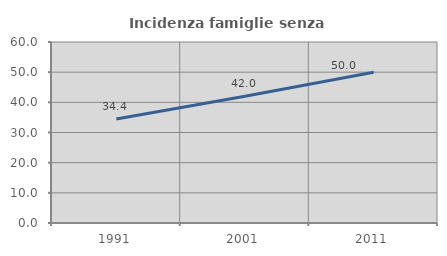
| Category | Incidenza famiglie senza nuclei |
|---|---|
| 1991.0 | 34.444 |
| 2001.0 | 41.989 |
| 2011.0 | 50 |